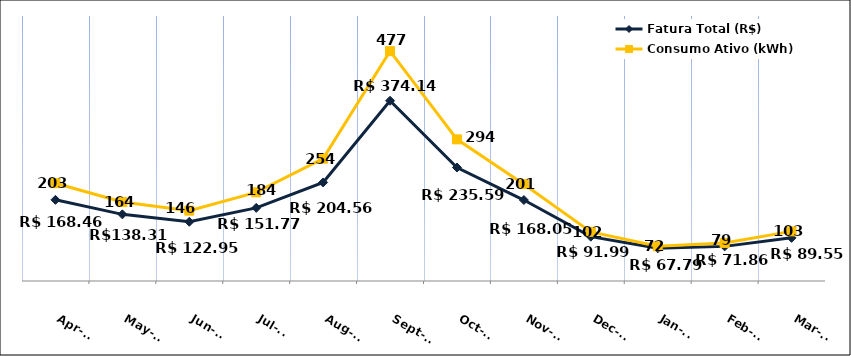
| Category | Fatura Total (R$) |
|---|---|
| 2023-04-01 | 168.46 |
| 2023-05-01 | 138.31 |
| 2023-06-01 | 122.95 |
| 2023-07-01 | 151.77 |
| 2023-08-01 | 204.56 |
| 2023-09-01 | 374.14 |
| 2023-10-01 | 235.59 |
| 2023-11-01 | 168.05 |
| 2023-12-01 | 91.99 |
| 2024-01-01 | 67.79 |
| 2024-02-01 | 71.86 |
| 2024-03-01 | 89.55 |